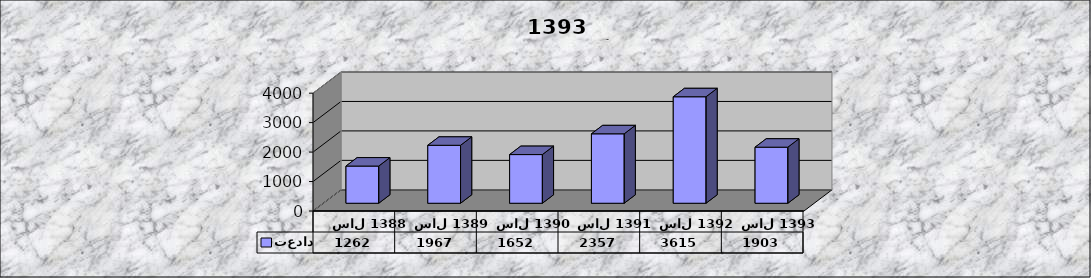
| Category | تعداد |
|---|---|
| سال 1388 | 1262 |
| سال 1389 | 1967 |
| سال 1390 | 1652 |
| سال 1391 | 2357 |
| سال 1392 | 3615 |
| سال 1393 | 1903 |